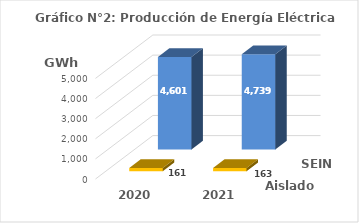
| Category | Aislados | SEIN |
|---|---|---|
| 2020.0 | 160.627 | 4601.159 |
| 2021.0 | 162.554 | 4738.933 |